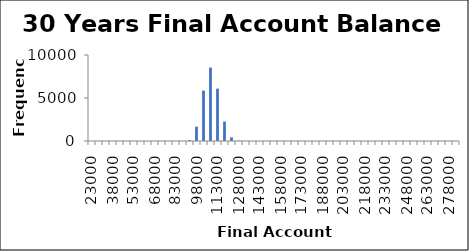
| Category | Frequency |
|---|---|
| 23000.0 | 0 |
| 28000.0 | 0 |
| 33000.0 | 0 |
| 38000.0 | 0 |
| 43000.0 | 0 |
| 48000.0 | 0 |
| 53000.0 | 0 |
| 58000.0 | 0 |
| 63000.0 | 0 |
| 68000.0 | 0 |
| 73000.0 | 0 |
| 78000.0 | 0 |
| 83000.0 | 0 |
| 88000.0 | 1 |
| 93000.0 | 120 |
| 98000.0 | 1666 |
| 103000.0 | 5863 |
| 108000.0 | 8543 |
| 113000.0 | 6085 |
| 118000.0 | 2255 |
| 123000.0 | 425 |
| 128000.0 | 41 |
| 133000.0 | 1 |
| 138000.0 | 0 |
| 143000.0 | 0 |
| 148000.0 | 0 |
| 153000.0 | 0 |
| 158000.0 | 0 |
| 163000.0 | 0 |
| 168000.0 | 0 |
| 173000.0 | 0 |
| 178000.0 | 0 |
| 183000.0 | 0 |
| 188000.0 | 0 |
| 193000.0 | 0 |
| 198000.0 | 0 |
| 203000.0 | 0 |
| 208000.0 | 0 |
| 213000.0 | 0 |
| 218000.0 | 0 |
| 223000.0 | 0 |
| 228000.0 | 0 |
| 233000.0 | 0 |
| 238000.0 | 0 |
| 243000.0 | 0 |
| 248000.0 | 0 |
| 253000.0 | 0 |
| 258000.0 | 0 |
| 263000.0 | 0 |
| 268000.0 | 0 |
| 273000.0 | 0 |
| 278000.0 | 0 |
| More | 0 |